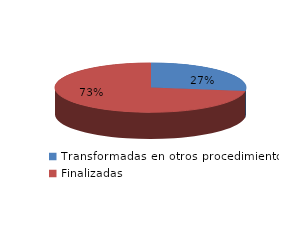
| Category | Series 0 |
|---|---|
| Transformadas en otros procedimientos | 1372 |
| Finalizadas | 3668 |